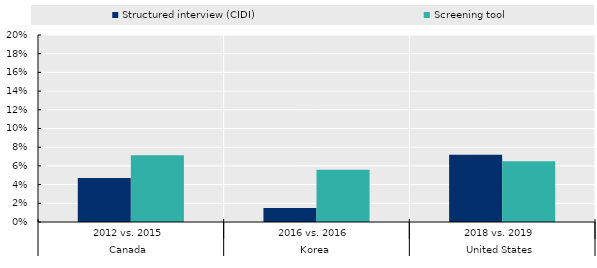
| Category | Structured interview (CIDI) | Screening tool |
|---|---|---|
| 0 | 0.047 | 0.071 |
| 1 | 0.015 | 0.056 |
| 2 | 0.072 | 0.065 |